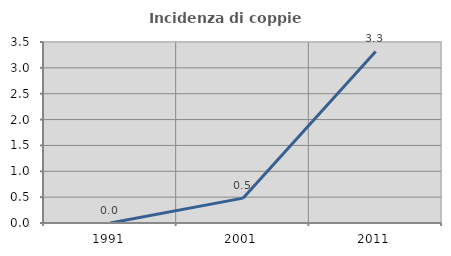
| Category | Incidenza di coppie miste |
|---|---|
| 1991.0 | 0 |
| 2001.0 | 0.481 |
| 2011.0 | 3.318 |